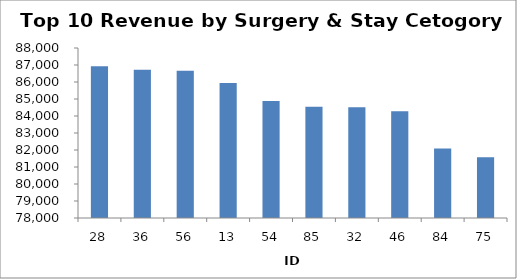
| Category | Total |
|---|---|
| 28 | 86927.833 |
| 36 | 86714.04 |
| 56 | 86661.67 |
| 13 | 85945.691 |
| 54 | 84886.1 |
| 85 | 84542.604 |
| 32 | 84517.061 |
| 46 | 84277.234 |
| 84 | 82091.614 |
| 75 | 81578.695 |